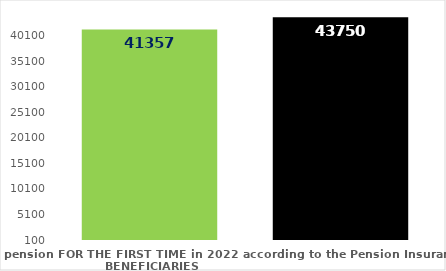
| Category | broj korisnika |
|---|---|
| Pension beneficiaries entitled to pension FOR THE FIRST TIME in 2022 according to the Pension Insurance Act  - NEW BENEFICIARIES | 41357 |
| Pension beneficiaries whose pension entitlement ceased in 2022  -  death caused,   
and who were retired according to the Pension Insurance Act   | 43750 |